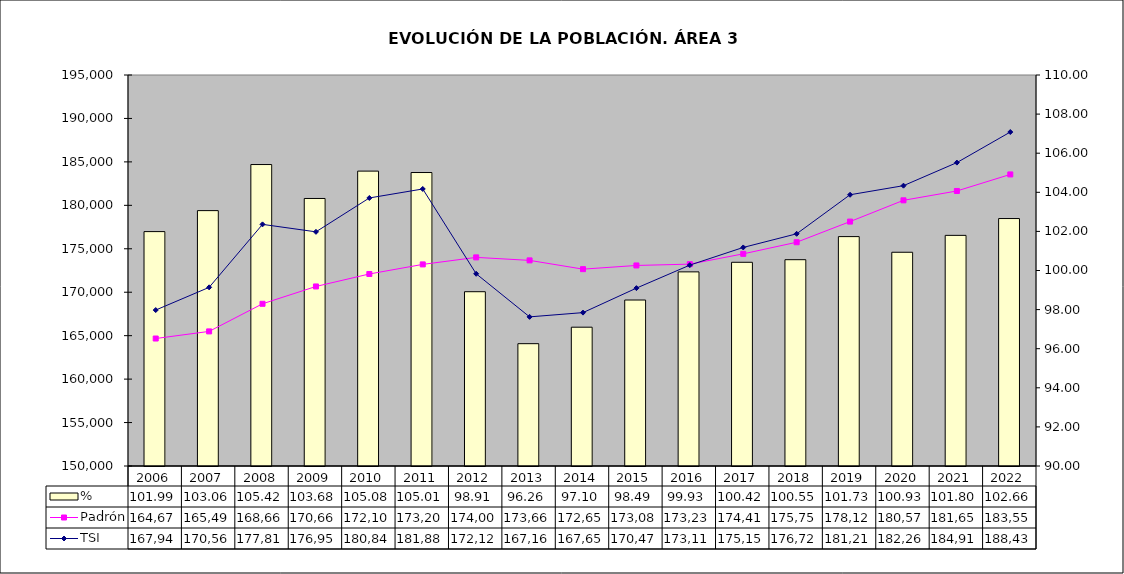
| Category | % |
|---|---|
| 2006.0 | 101.989 |
| 2007.0 | 103.063 |
| 2008.0 | 105.42 |
| 2009.0 | 103.684 |
| 2010.0 | 105.084 |
| 2011.0 | 105.011 |
| 2012.0 | 98.915 |
| 2013.0 | 96.257 |
| 2014.0 | 97.1 |
| 2015.0 | 98.49 |
| 2016.0 | 99.93 |
| 2017.0 | 100.42 |
| 2018.0 | 100.553 |
| 2019.0 | 101.734 |
| 2020.0 | 100.933 |
| 2021.0 | 101.797 |
| 2022.0 | 102.658 |